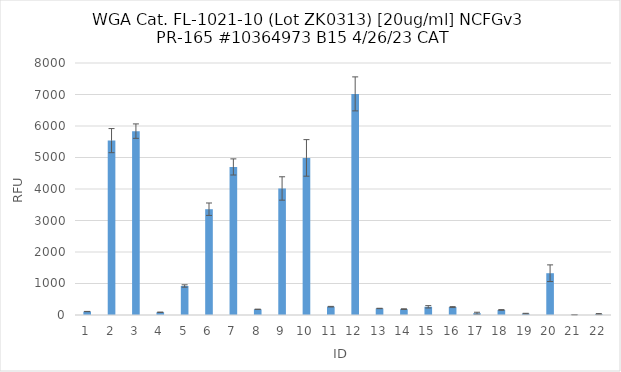
| Category | RFU |
|---|---|
| 0 | 110 |
| 1 | 5535.75 |
| 2 | 5837.25 |
| 3 | 86.5 |
| 4 | 920.75 |
| 5 | 3358.75 |
| 6 | 4700 |
| 7 | 181 |
| 8 | 4017 |
| 9 | 4987.25 |
| 10 | 264.25 |
| 11 | 7019.75 |
| 12 | 207.75 |
| 13 | 186.25 |
| 14 | 260.25 |
| 15 | 251 |
| 16 | 56 |
| 17 | 160.25 |
| 18 | 44 |
| 19 | 1326.5 |
| 20 | 8 |
| 21 | 28.75 |